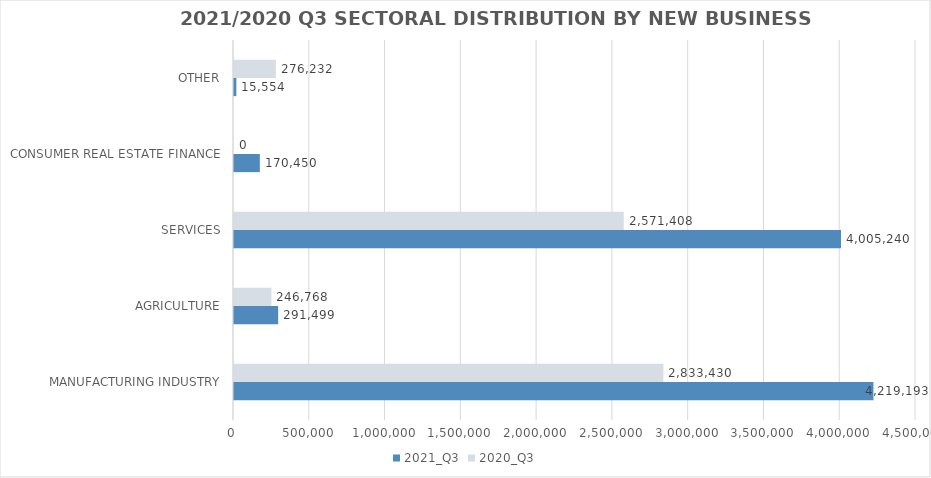
| Category | 2021_Q3 | 2020_Q3 |
|---|---|---|
| MANUFACTURING INDUSTRY | 4219193.223 | 2833430.156 |
| AGRICULTURE | 291499.276 | 246767.964 |
| SERVICES | 4005239.943 | 2571407.774 |
| CONSUMER REAL ESTATE FINANCE | 170450 | 0 |
| OTHER | 15554 | 276232 |